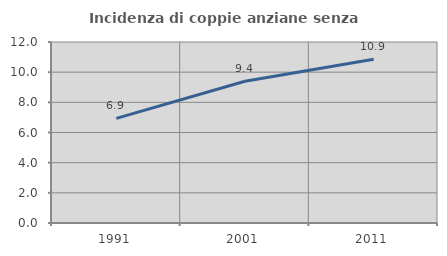
| Category | Incidenza di coppie anziane senza figli  |
|---|---|
| 1991.0 | 6.94 |
| 2001.0 | 9.394 |
| 2011.0 | 10.85 |